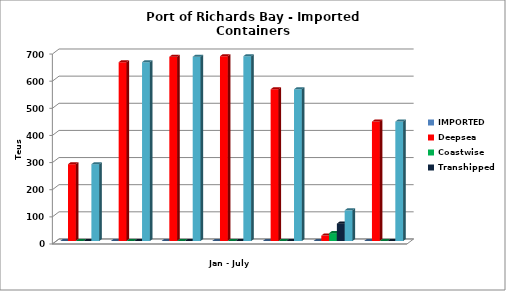
| Category | IMPORTED | Deepsea | Coastwise | Transhipped | SubTotal Landed (Imported) |
|---|---|---|---|---|---|
|  | 0 | 283 | 0 | 0 | 283 |
|  | 0 | 659 | 0 | 0 | 659 |
|  | 0 | 679 | 0 | 0 | 679 |
|  | 0 | 681 | 0 | 0 | 681 |
|  | 0 | 559 | 0 | 0 | 559 |
|  | 0 | 20 | 29 | 64 | 113 |
|  | 0 | 440 | 0 | 0 | 440 |